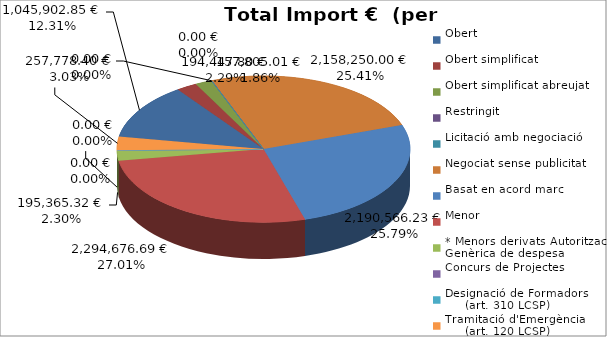
| Category | Total preu
(amb IVA) |
|---|---|
| Obert | 1045902.85 |
| Obert simplificat | 194447.8 |
| Obert simplificat abreujat | 157805.01 |
| Restringit | 0 |
| Licitació amb negociació | 0 |
| Negociat sense publicitat | 2158250 |
| Basat en acord marc | 2190566.23 |
| Menor | 2294676.69 |
| * Menors derivats Autorització Genèrica de despesa | 195365.32 |
| Concurs de Projectes | 0 |
| Designació de Formadors
     (art. 310 LCSP) | 0 |
| Tramitació d'Emergència
     (art. 120 LCSP) | 257778.4 |